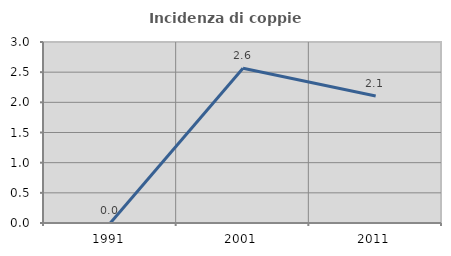
| Category | Incidenza di coppie miste |
|---|---|
| 1991.0 | 0 |
| 2001.0 | 2.564 |
| 2011.0 | 2.105 |